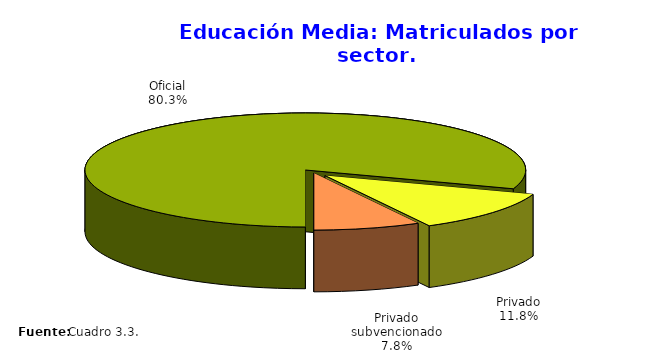
| Category | Series 0 |
|---|---|
| Oficial | 209822 |
| Privado | 30846 |
| Privado subvencionado | 20479 |